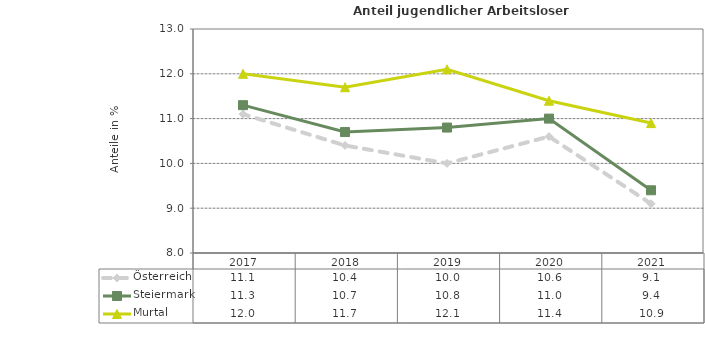
| Category | Österreich | Steiermark | Murtal |
|---|---|---|---|
| 2021.0 | 9.1 | 9.4 | 10.9 |
| 2020.0 | 10.6 | 11 | 11.4 |
| 2019.0 | 10 | 10.8 | 12.1 |
| 2018.0 | 10.4 | 10.7 | 11.7 |
| 2017.0 | 11.1 | 11.3 | 12 |